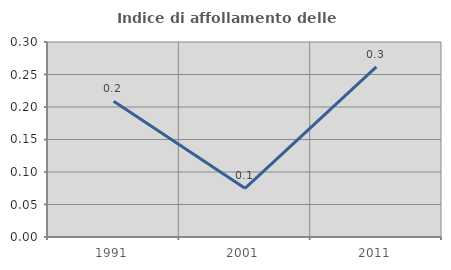
| Category | Indice di affollamento delle abitazioni  |
|---|---|
| 1991.0 | 0.209 |
| 2001.0 | 0.075 |
| 2011.0 | 0.262 |